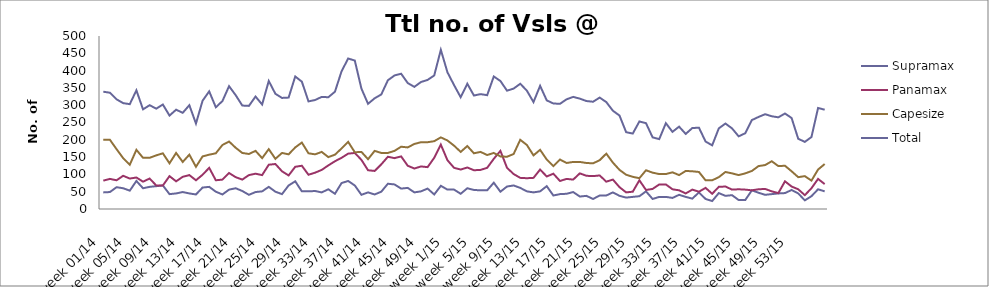
| Category | Supramax | Panamax | Capesize | Total |
|---|---|---|---|---|
| week 01/14 | 48 | 82 | 200 | 339 |
| week 02/14 | 49 | 87 | 200 | 336 |
| week 03/14 | 63 | 83 | 173 | 317 |
| week 04/14 | 60 | 96 | 147 | 306 |
| week 05/14 | 53 | 88 | 128 | 303 |
| week 06/14 | 81 | 91 | 171 | 343 |
| week 07/14 | 60 | 79 | 148 | 288 |
| week 08/14 | 64 | 88 | 148 | 300 |
| week 09/14 | 66 | 68 | 155 | 290 |
| week 10/14 | 68 | 68 | 161 | 302 |
| week 11/14 | 43 | 95 | 132 | 270 |
| week 12/14 | 45 | 80 | 162 | 287 |
| week 13/14 | 49 | 93 | 136 | 278 |
| week 14/14 | 45 | 98 | 157 | 300 |
| week 15/14 | 42 | 83 | 122 | 247 |
| week 16/14 | 62 | 99 | 152 | 313 |
| week 17/14 | 64 | 119 | 157 | 340 |
| week 18/14 | 50 | 83 | 161 | 294 |
| week 19/14 | 42 | 85 | 185 | 312 |
| week 20/14 | 56 | 104 | 195 | 355 |
| week 21/14 | 60 | 92 | 177 | 329 |
| week 22/14 | 52 | 85 | 162 | 299 |
| week 23/14 | 41 | 98 | 159 | 298 |
| week 24/14 | 49 | 102 | 168 | 325 |
| week 25/14 | 51 | 98 | 147 | 302 |
| week 26/14 | 64 | 128 | 173 | 370 |
| week 27/14 | 50 | 130 | 145 | 333 |
| week 28/14 | 43 | 109 | 162 | 321 |
| week 29/14 | 68 | 97 | 158 | 322 |
| week 30/14 | 80 | 122 | 178 | 383 |
| week 31/14 | 51 | 125 | 192 | 368 |
| week 32/14 | 51 | 99 | 161 | 311 |
| week 33/14 | 52 | 105 | 158 | 315 |
| week 34/14 | 48 | 113 | 165 | 324 |
| week 35/14 | 57 | 126 | 150 | 323 |
| week 36/14 | 44 | 138 | 157 | 339 |
| week 37/14 | 75 | 148 | 175 | 398 |
| week 38/14 | 81 | 160 | 194 | 435 |
| week 39/14 | 68 | 162 | 164 | 429 |
| week 40/14 | 41 | 142 | 165 | 348 |
| week 41/14 | 48 | 112 | 144 | 304 |
| week 42/14 | 42 | 110 | 168 | 320 |
| week 43/14 | 50 | 129 | 162 | 331 |
| week 44/14 | 73 | 151 | 162 | 372 |
| week 45/14 | 71 | 147 | 168 | 386 |
| week 46/14 | 59 | 152 | 180 | 391 |
| week 47/14 | 61 | 125 | 178 | 364 |
| week 48/14 | 48 | 117 | 188 | 353 |
| week 49/14 | 51 | 123 | 193 | 367 |
| week 50/14 | 59 | 121 | 193 | 373 |
| week 51/14 | 42 | 148 | 196 | 386 |
| week 52/14 | 67 | 186 | 207 | 460 |
| week 1/15 | 56 | 141 | 198 | 395 |
| week 2/15 | 56 | 119 | 183 | 358 |
| week 3/15 | 44 | 114 | 165 | 323 |
| week 4/15 | 60 | 120 | 182 | 362 |
| week 5/15 | 55 | 112 | 161 | 328 |
| week 6/15 | 54 | 113 | 165 | 332 |
| week 7/15 | 54 | 119 | 156 | 329 |
| week 8/15 | 76 | 145 | 162 | 383 |
| week 9/15 | 50 | 168 | 152 | 370 |
| week 10/15 | 65 | 119 | 151 | 342 |
| week 11/15 | 68 | 101 | 159 | 348 |
| week 12/15 | 61 | 90 | 200 | 362 |
| week 13/15 | 51 | 89 | 185 | 342 |
| week 14/15 | 48 | 90 | 155 | 309 |
| week 15/15 | 51 | 114 | 171 | 356 |
| week 16/15 | 66 | 94 | 143 | 314 |
| week 17/15 | 39 | 102 | 124 | 305 |
| week 18/15 | 43 | 81 | 143 | 304 |
| week 19/15 | 44 | 87 | 133 | 317 |
| week 20/15 | 49 | 85 | 136 | 324 |
| week 21/15 | 36 | 103 | 136 | 319 |
| week 22/15 | 38 | 96 | 133 | 312 |
| week 23/15 | 29 | 95 | 132 | 310 |
| week 24/15 | 39 | 97 | 141 | 322 |
| week 25/15 | 39 | 79 | 160 | 309 |
| week 26/15 | 48 | 85 | 134 | 284 |
| week 27/15 | 38 | 63 | 113 | 270 |
| week 28/15 | 33 | 48 | 99 | 222 |
| week 29/15 | 35 | 50 | 93 | 218 |
| week 30/15 | 37 | 83 | 89 | 253 |
| week 31/15 | 51 | 55 | 112 | 248 |
| week 32/15 | 29 | 58 | 105 | 207 |
| week 33/15 | 35 | 71 | 101 | 202 |
| week 34/15 | 35 | 71 | 101 | 248 |
| week 35/15 | 32 | 57 | 106 | 223 |
| week 36/15 | 41 | 54 | 98 | 238 |
| week 37/15 | 35 | 45 | 110 | 217 |
| week 38/15 | 30 | 56 | 109 | 234 |
| week 39/15 | 48 | 50 | 107 | 235 |
| week 40/15 | 29 | 61 | 83 | 195 |
| week 41/15 | 23 | 44 | 83 | 184 |
| week 42/15 | 46 | 64 | 92 | 233 |
| week 43/15 | 38 | 65 | 107 | 247 |
| week 44/15 | 40 | 56 | 103 | 233 |
| week 45/15 | 26 | 57 | 98 | 210 |
| week 46/15 | 26 | 56 | 103 | 219 |
| week 47/15 | 54 | 54 | 110 | 257 |
| week 48/15 | 47 | 57 | 124 | 266 |
| week 49/15 | 41 | 58 | 127 | 274 |
| week 50/15 | 43 | 51 | 138 | 268 |
| week 51/15 | 45 | 46 | 124 | 265 |
| week 52/15 | 46 | 80 | 125 | 276 |
| week 53/15 | 55 | 65 | 109 | 263 |
| week 01/16 | 45 | 57 | 92 | 203 |